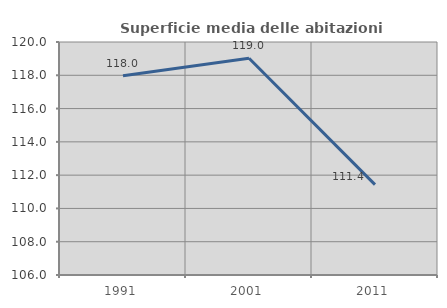
| Category | Superficie media delle abitazioni occupate |
|---|---|
| 1991.0 | 117.975 |
| 2001.0 | 119.021 |
| 2011.0 | 111.43 |